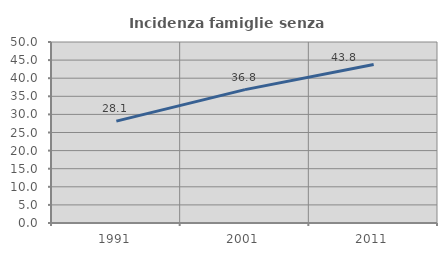
| Category | Incidenza famiglie senza nuclei |
|---|---|
| 1991.0 | 28.143 |
| 2001.0 | 36.842 |
| 2011.0 | 43.78 |